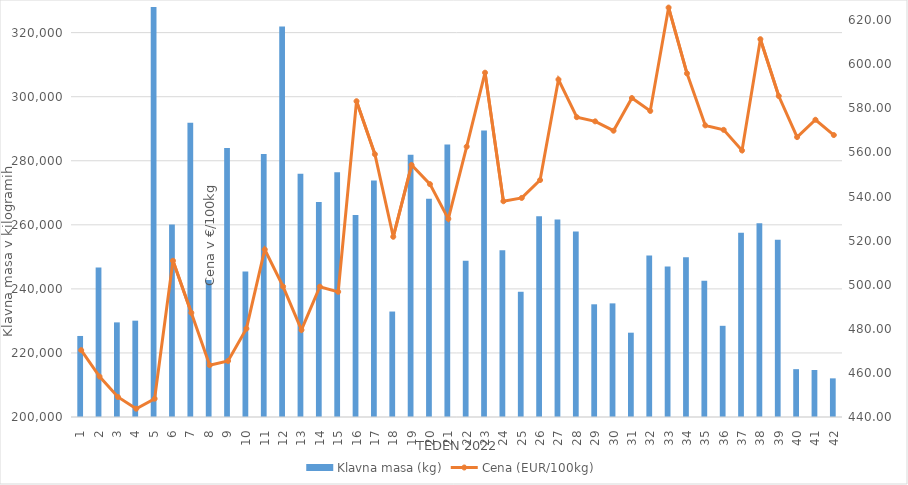
| Category | Klavna masa (kg) |
|---|---|
| 1.0 | 225300 |
| 2.0 | 246712 |
| 3.0 | 229541 |
| 4.0 | 230074 |
| 5.0 | 328640 |
| 6.0 | 260108 |
| 7.0 | 291887 |
| 8.0 | 242732 |
| 9.0 | 283987 |
| 10.0 | 245414 |
| 11.0 | 282092 |
| 12.0 | 321936 |
| 13.0 | 275950 |
| 14.0 | 267148 |
| 15.0 | 276417 |
| 16.0 | 263098 |
| 17.0 | 273824 |
| 18.0 | 232926 |
| 19.0 | 281859 |
| 20.0 | 268153 |
| 21.0 | 285073 |
| 22.0 | 248783 |
| 23.0 | 289478 |
| 24.0 | 252069 |
| 25.0 | 239099 |
| 26.0 | 262689 |
| 27.0 | 261656 |
| 28.0 | 257905 |
| 29.0 | 235185 |
| 30.0 | 235475 |
| 31.0 | 226322 |
| 32.0 | 250418 |
| 33.0 | 246996 |
| 34.0 | 249873 |
| 35.0 | 242516 |
| 36.0 | 228469 |
| 37.0 | 257511 |
| 38.0 | 260481 |
| 39.0 | 255370 |
| 40.0 | 214936 |
| 41.0 | 214672 |
| 42.0 | 212066 |